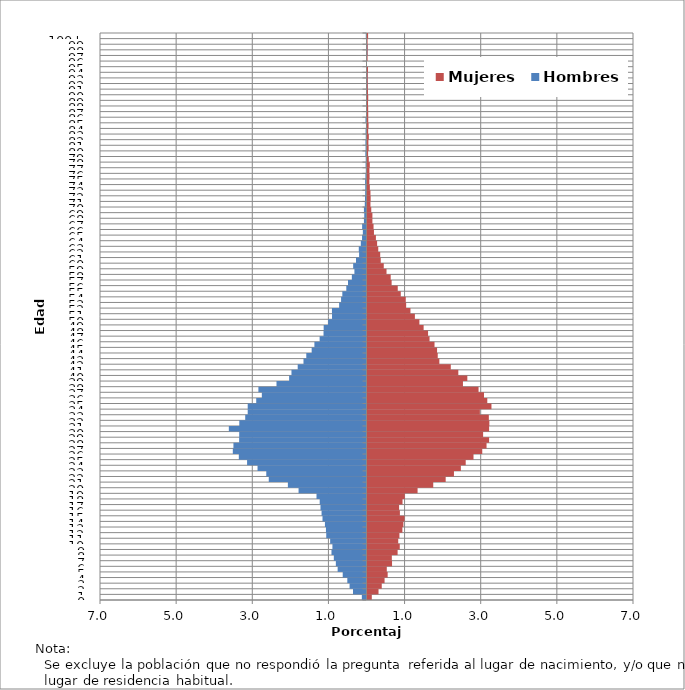
| Category | Hombres | Mujeres |
|---|---|---|
| 0 | -0.123 | 0.113 |
| 1 | -0.354 | 0.29 |
| 2 | -0.445 | 0.374 |
| 3 | -0.504 | 0.448 |
| 4 | -0.625 | 0.53 |
| 5 | -0.758 | 0.507 |
| 6 | -0.805 | 0.644 |
| 7 | -0.858 | 0.639 |
| 8 | -0.92 | 0.791 |
| 9 | -0.895 | 0.848 |
| 10 | -0.955 | 0.807 |
| 11 | -1.057 | 0.839 |
| 12 | -1.065 | 0.916 |
| 13 | -1.092 | 0.943 |
| 14 | -1.155 | 0.973 |
| 15 | -1.18 | 0.851 |
| 16 | -1.209 | 0.83 |
| 17 | -1.229 | 0.92 |
| 18 | -1.313 | 0.978 |
| 19 | -1.784 | 1.315 |
| 20 | -2.065 | 1.727 |
| 21 | -2.567 | 2.054 |
| 22 | -2.633 | 2.271 |
| 23 | -2.862 | 2.453 |
| 24 | -3.137 | 2.58 |
| 25 | -3.354 | 2.785 |
| 26 | -3.512 | 3.014 |
| 27 | -3.495 | 3.127 |
| 28 | -3.346 | 3.194 |
| 29 | -3.344 | 3.037 |
| 30 | -3.616 | 3.194 |
| 31 | -3.341 | 3.201 |
| 32 | -3.186 | 3.187 |
| 33 | -3.12 | 2.952 |
| 34 | -3.12 | 3.256 |
| 35 | -2.897 | 3.147 |
| 36 | -2.749 | 3.06 |
| 37 | -2.84 | 2.917 |
| 38 | -2.364 | 2.507 |
| 39 | -2.032 | 2.622 |
| 40 | -1.971 | 2.385 |
| 41 | -1.807 | 2.188 |
| 42 | -1.655 | 1.888 |
| 43 | -1.582 | 1.845 |
| 44 | -1.44 | 1.828 |
| 45 | -1.369 | 1.76 |
| 46 | -1.231 | 1.63 |
| 47 | -1.129 | 1.591 |
| 48 | -1.125 | 1.474 |
| 49 | -1.008 | 1.363 |
| 50 | -0.906 | 1.245 |
| 51 | -0.908 | 1.128 |
| 52 | -0.719 | 1.015 |
| 53 | -0.668 | 1.005 |
| 54 | -0.635 | 0.874 |
| 55 | -0.531 | 0.795 |
| 56 | -0.486 | 0.634 |
| 57 | -0.385 | 0.609 |
| 58 | -0.318 | 0.5 |
| 59 | -0.35 | 0.427 |
| 60 | -0.277 | 0.348 |
| 61 | -0.195 | 0.334 |
| 62 | -0.203 | 0.283 |
| 63 | -0.15 | 0.252 |
| 64 | -0.117 | 0.221 |
| 65 | -0.096 | 0.17 |
| 66 | -0.115 | 0.159 |
| 67 | -0.068 | 0.129 |
| 68 | -0.059 | 0.129 |
| 69 | -0.068 | 0.099 |
| 70 | -0.045 | 0.078 |
| 71 | -0.039 | 0.083 |
| 72 | -0.035 | 0.078 |
| 73 | -0.033 | 0.062 |
| 74 | -0.037 | 0.048 |
| 75 | -0.029 | 0.055 |
| 76 | -0.018 | 0.049 |
| 77 | -0.025 | 0.06 |
| 78 | -0.02 | 0.034 |
| 79 | -0.031 | 0.016 |
| 80 | -0.025 | 0.03 |
| 81 | -0.029 | 0.023 |
| 82 | -0.02 | 0.035 |
| 83 | -0.025 | 0.018 |
| 84 | -0.014 | 0.028 |
| 85 | -0.027 | 0.019 |
| 86 | -0.01 | 0.019 |
| 87 | -0.008 | 0.018 |
| 88 | -0.006 | 0.014 |
| 89 | -0.006 | 0.019 |
| 90 | -0.008 | 0.012 |
| 91 | -0.004 | 0.007 |
| 92 | -0.006 | 0.005 |
| 93 | -0.002 | 0.005 |
| 94 | -0.002 | 0.012 |
| 95 | 0 | 0 |
| 96 | 0 | 0.002 |
| 97 | -0.002 | 0.002 |
| 98 | -0.002 | 0.004 |
| 99 | 0 | 0.002 |
| 100+ | -0.018 | 0.016 |